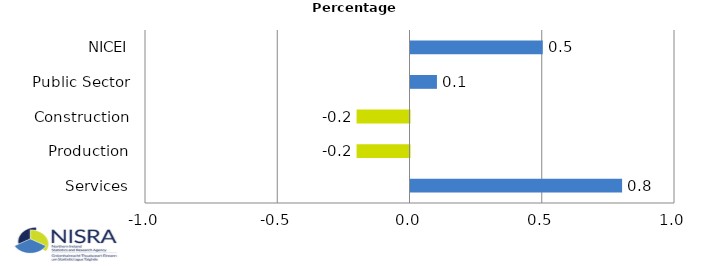
| Category | Percentage Points |
|---|---|
| Services | 0.8 |
| Production | -0.2 |
| Construction | -0.2 |
| Public Sector | 0.1 |
| NICEI | 0.5 |